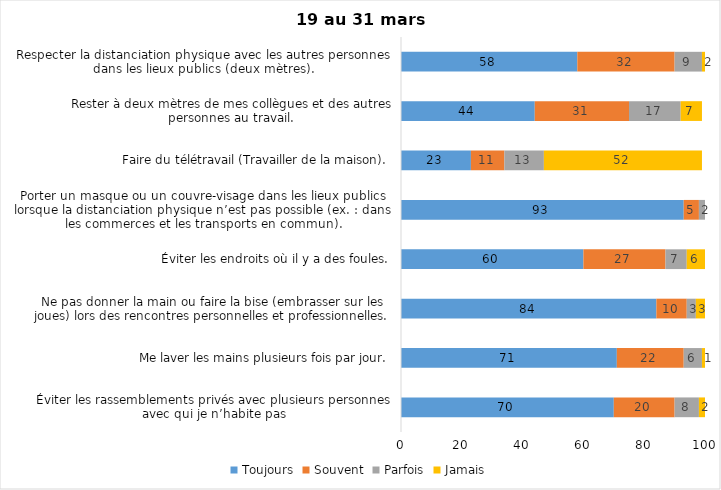
| Category | Toujours | Souvent | Parfois | Jamais |
|---|---|---|---|---|
| Éviter les rassemblements privés avec plusieurs personnes avec qui je n’habite pas | 70 | 20 | 8 | 2 |
| Me laver les mains plusieurs fois par jour. | 71 | 22 | 6 | 1 |
| Ne pas donner la main ou faire la bise (embrasser sur les joues) lors des rencontres personnelles et professionnelles. | 84 | 10 | 3 | 3 |
| Éviter les endroits où il y a des foules. | 60 | 27 | 7 | 6 |
| Porter un masque ou un couvre-visage dans les lieux publics lorsque la distanciation physique n’est pas possible (ex. : dans les commerces et les transports en commun). | 93 | 5 | 2 | 0 |
| Faire du télétravail (Travailler de la maison). | 23 | 11 | 13 | 52 |
| Rester à deux mètres de mes collègues et des autres personnes au travail. | 44 | 31 | 17 | 7 |
| Respecter la distanciation physique avec les autres personnes dans les lieux publics (deux mètres). | 58 | 32 | 9 | 2 |